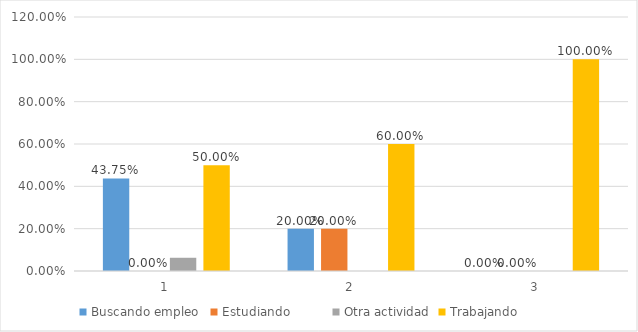
| Category | Buscando empleo  | Estudiando          | Otra actividad | Trabajando          |
|---|---|---|---|---|
| 0 | 0.438 | 0 | 0.062 | 0.5 |
| 1 | 0.2 | 0.2 | 0 | 0.6 |
| 2 | 0 | 0 | 0 | 1 |